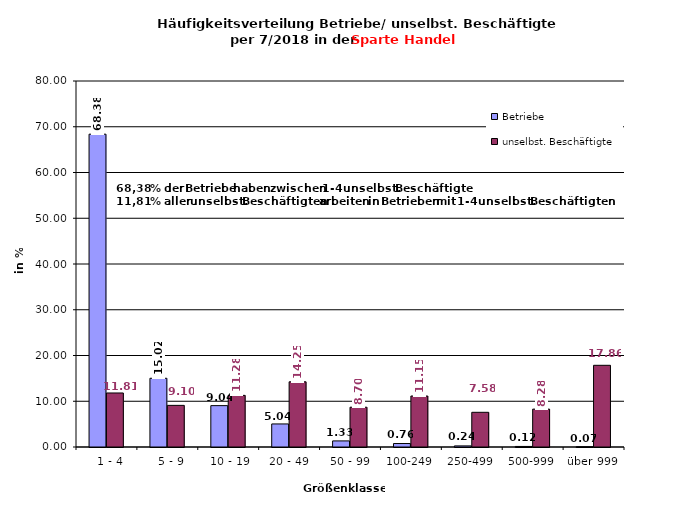
| Category | Betriebe | unselbst. Beschäftigte |
|---|---|---|
|   1 - 4 | 68.377 | 11.807 |
|   5 - 9 | 15.022 | 9.099 |
|  10 - 19 | 9.041 | 11.284 |
| 20 - 49 | 5.041 | 14.248 |
| 50 - 99 | 1.33 | 8.696 |
| 100-249 | 0.76 | 11.146 |
| 250-499 | 0.24 | 7.584 |
| 500-999 | 0.12 | 8.281 |
| über 999 | 0.07 | 17.855 |